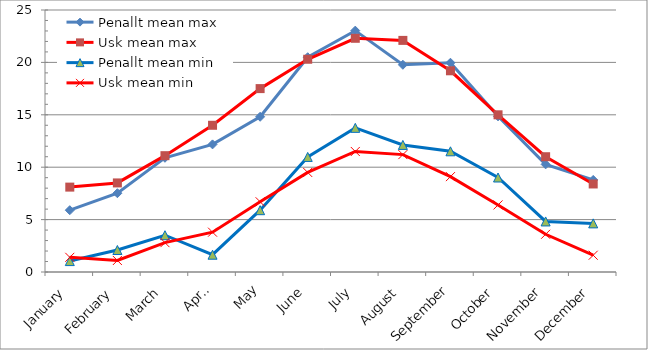
| Category | Penallt mean max | Usk mean max | Penallt mean min | Usk mean min |
|---|---|---|---|---|
| January | 5.897 | 8.1 | 1.042 | 1.4 |
| February | 7.518 | 8.5 | 2.1 | 1.1 |
| March | 10.9 | 11.1 | 3.51 | 2.8 |
| April | 12.177 | 14 | 1.65 | 3.8 |
| May | 14.813 | 17.5 | 5.897 | 6.7 |
| June | 20.493 | 20.3 | 10.98 | 9.5 |
| July | 23.029 | 22.3 | 13.755 | 11.5 |
| August | 19.774 | 22.1 | 12.126 | 11.2 |
| September | 19.967 | 19.2 | 11.517 | 9.1 |
| October | 14.855 | 15 | 9.016 | 6.4 |
| November | 10.27 | 11 | 4.823 | 3.6 |
| December | 8.784 | 8.4 | 4.639 | 1.6 |